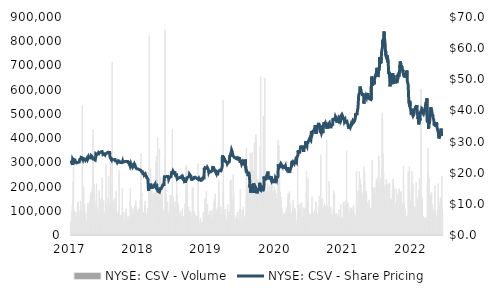
| Category | NYSE: CSV - Volume |
|---|---|
| 2017-10-13 | 52500 |
| 2017-10-16 | 56900 |
| 2017-10-17 | 97900 |
| 2017-10-18 | 36500 |
| 2017-10-19 | 77600 |
| 2017-10-20 | 123300 |
| 2017-10-23 | 126600 |
| 2017-10-24 | 219000 |
| 2017-10-25 | 149900 |
| 2017-10-26 | 285400 |
| 2017-10-27 | 97000 |
| 2017-10-30 | 99300 |
| 2017-10-31 | 71600 |
| 2017-11-01 | 91600 |
| 2017-11-02 | 77100 |
| 2017-11-03 | 48700 |
| 2017-11-06 | 57600 |
| 2017-11-07 | 92800 |
| 2017-11-08 | 62000 |
| 2017-11-09 | 71000 |
| 2017-11-10 | 55100 |
| 2017-11-13 | 69200 |
| 2017-11-14 | 52200 |
| 2017-11-15 | 120900 |
| 2017-11-16 | 133900 |
| 2017-11-17 | 137100 |
| 2017-11-20 | 61500 |
| 2017-11-21 | 95400 |
| 2017-11-22 | 38800 |
| 2017-11-24 | 35700 |
| 2017-11-27 | 68900 |
| 2017-11-28 | 79100 |
| 2017-11-29 | 139900 |
| 2017-11-30 | 105800 |
| 2017-12-01 | 87800 |
| 2017-12-04 | 66400 |
| 2017-12-05 | 78700 |
| 2017-12-06 | 100400 |
| 2017-12-07 | 82900 |
| 2017-12-08 | 535800 |
| 2017-12-11 | 80200 |
| 2017-12-12 | 78500 |
| 2017-12-13 | 70700 |
| 2017-12-14 | 58300 |
| 2017-12-15 | 199800 |
| 2017-12-18 | 107200 |
| 2017-12-19 | 125400 |
| 2017-12-20 | 75200 |
| 2017-12-21 | 91300 |
| 2017-12-22 | 81200 |
| 2017-12-26 | 39900 |
| 2017-12-27 | 44900 |
| 2017-12-28 | 61300 |
| 2017-12-29 | 56900 |
| 2018-01-02 | 105300 |
| 2018-01-03 | 119400 |
| 2018-01-04 | 130600 |
| 2018-01-05 | 69900 |
| 2018-01-08 | 110500 |
| 2018-01-09 | 76400 |
| 2018-01-10 | 97900 |
| 2018-01-11 | 82900 |
| 2018-01-12 | 135000 |
| 2018-01-16 | 88900 |
| 2018-01-17 | 162300 |
| 2018-01-18 | 159300 |
| 2018-01-19 | 175900 |
| 2018-01-22 | 86800 |
| 2018-01-23 | 53700 |
| 2018-01-24 | 167500 |
| 2018-01-25 | 190800 |
| 2018-01-26 | 73400 |
| 2018-01-29 | 435000 |
| 2018-01-30 | 125100 |
| 2018-01-31 | 316600 |
| 2018-02-01 | 112600 |
| 2018-02-02 | 81700 |
| 2018-02-05 | 207800 |
| 2018-02-06 | 169000 |
| 2018-02-07 | 125300 |
| 2018-02-08 | 84200 |
| 2018-02-09 | 107400 |
| 2018-02-12 | 75400 |
| 2018-02-13 | 70900 |
| 2018-02-14 | 80800 |
| 2018-02-15 | 144400 |
| 2018-02-16 | 211200 |
| 2018-02-20 | 113400 |
| 2018-02-21 | 51300 |
| 2018-02-22 | 69300 |
| 2018-02-23 | 47300 |
| 2018-02-26 | 96300 |
| 2018-02-27 | 70300 |
| 2018-02-28 | 61700 |
| 2018-03-01 | 184300 |
| 2018-03-02 | 149200 |
| 2018-03-05 | 90400 |
| 2018-03-06 | 88700 |
| 2018-03-07 | 57100 |
| 2018-03-08 | 61800 |
| 2018-03-09 | 149400 |
| 2018-03-12 | 99600 |
| 2018-03-13 | 110100 |
| 2018-03-14 | 108300 |
| 2018-03-15 | 237700 |
| 2018-03-16 | 125100 |
| 2018-03-19 | 65000 |
| 2018-03-20 | 47200 |
| 2018-03-21 | 61500 |
| 2018-03-22 | 69600 |
| 2018-03-23 | 144000 |
| 2018-03-26 | 72800 |
| 2018-03-27 | 64900 |
| 2018-03-28 | 86300 |
| 2018-03-29 | 91100 |
| 2018-04-02 | 78300 |
| 2018-04-03 | 291900 |
| 2018-04-04 | 121600 |
| 2018-04-05 | 92400 |
| 2018-04-06 | 115100 |
| 2018-04-09 | 60800 |
| 2018-04-10 | 95300 |
| 2018-04-11 | 67500 |
| 2018-04-12 | 69100 |
| 2018-04-13 | 153000 |
| 2018-04-16 | 242700 |
| 2018-04-17 | 125500 |
| 2018-04-18 | 57500 |
| 2018-04-19 | 35000 |
| 2018-04-20 | 97300 |
| 2018-04-23 | 77000 |
| 2018-04-24 | 123200 |
| 2018-04-25 | 308200 |
| 2018-04-26 | 277500 |
| 2018-04-27 | 173600 |
| 2018-04-30 | 151500 |
| 2018-05-01 | 164900 |
| 2018-05-02 | 118200 |
| 2018-05-03 | 712600 |
| 2018-05-04 | 199000 |
| 2018-05-07 | 58800 |
| 2018-05-08 | 64000 |
| 2018-05-09 | 93100 |
| 2018-05-10 | 140900 |
| 2018-05-11 | 90800 |
| 2018-05-14 | 106100 |
| 2018-05-15 | 96700 |
| 2018-05-16 | 149600 |
| 2018-05-17 | 79800 |
| 2018-05-18 | 124300 |
| 2018-05-21 | 108100 |
| 2018-05-22 | 179200 |
| 2018-05-23 | 76600 |
| 2018-05-24 | 121800 |
| 2018-05-25 | 83600 |
| 2018-05-29 | 80900 |
| 2018-05-30 | 94300 |
| 2018-05-31 | 82400 |
| 2018-06-01 | 89300 |
| 2018-06-04 | 101200 |
| 2018-06-05 | 97300 |
| 2018-06-06 | 267600 |
| 2018-06-07 | 81700 |
| 2018-06-08 | 64700 |
| 2018-06-11 | 59600 |
| 2018-06-12 | 78300 |
| 2018-06-13 | 67000 |
| 2018-06-14 | 66200 |
| 2018-06-15 | 81800 |
| 2018-06-18 | 39200 |
| 2018-06-19 | 48900 |
| 2018-06-20 | 72900 |
| 2018-06-21 | 85400 |
| 2018-06-22 | 191100 |
| 2018-06-25 | 76500 |
| 2018-06-26 | 55400 |
| 2018-06-27 | 71400 |
| 2018-06-28 | 84900 |
| 2018-06-29 | 95300 |
| 2018-07-02 | 61000 |
| 2018-07-03 | 50900 |
| 2018-07-05 | 59000 |
| 2018-07-06 | 51400 |
| 2018-07-09 | 92000 |
| 2018-07-10 | 107200 |
| 2018-07-11 | 81900 |
| 2018-07-12 | 35000 |
| 2018-07-13 | 55700 |
| 2018-07-16 | 49000 |
| 2018-07-17 | 58300 |
| 2018-07-18 | 48800 |
| 2018-07-19 | 49400 |
| 2018-07-20 | 78100 |
| 2018-07-23 | 49100 |
| 2018-07-24 | 43200 |
| 2018-07-25 | 44900 |
| 2018-07-26 | 65700 |
| 2018-07-27 | 50300 |
| 2018-07-30 | 72900 |
| 2018-07-31 | 143700 |
| 2018-08-01 | 191900 |
| 2018-08-02 | 123900 |
| 2018-08-03 | 116000 |
| 2018-08-06 | 86600 |
| 2018-08-07 | 73400 |
| 2018-08-08 | 89700 |
| 2018-08-09 | 65500 |
| 2018-08-10 | 28200 |
| 2018-08-13 | 108200 |
| 2018-08-14 | 72200 |
| 2018-08-15 | 77100 |
| 2018-08-16 | 84300 |
| 2018-08-17 | 58900 |
| 2018-08-20 | 79600 |
| 2018-08-21 | 77700 |
| 2018-08-22 | 120100 |
| 2018-08-23 | 97800 |
| 2018-08-24 | 83900 |
| 2018-08-27 | 141200 |
| 2018-08-28 | 50000 |
| 2018-08-29 | 42000 |
| 2018-08-30 | 113500 |
| 2018-08-31 | 77600 |
| 2018-09-04 | 61600 |
| 2018-09-05 | 95500 |
| 2018-09-06 | 87100 |
| 2018-09-07 | 103700 |
| 2018-09-10 | 89800 |
| 2018-09-11 | 108000 |
| 2018-09-12 | 102100 |
| 2018-09-13 | 63200 |
| 2018-09-14 | 59600 |
| 2018-09-17 | 54500 |
| 2018-09-18 | 142500 |
| 2018-09-19 | 147600 |
| 2018-09-20 | 70800 |
| 2018-09-21 | 335600 |
| 2018-09-24 | 104900 |
| 2018-09-25 | 107200 |
| 2018-09-26 | 170700 |
| 2018-09-27 | 82200 |
| 2018-09-28 | 98900 |
| 2018-10-01 | 91200 |
| 2018-10-02 | 92200 |
| 2018-10-03 | 75000 |
| 2018-10-04 | 85200 |
| 2018-10-05 | 75600 |
| 2018-10-08 | 57100 |
| 2018-10-09 | 45900 |
| 2018-10-10 | 97200 |
| 2018-10-11 | 124300 |
| 2018-10-12 | 140800 |
| 2018-10-15 | 84800 |
| 2018-10-16 | 69400 |
| 2018-10-17 | 85700 |
| 2018-10-18 | 81100 |
| 2018-10-19 | 53400 |
| 2018-10-22 | 65600 |
| 2018-10-23 | 110100 |
| 2018-10-24 | 74800 |
| 2018-10-25 | 90300 |
| 2018-10-26 | 101300 |
| 2018-10-29 | 68200 |
| 2018-10-30 | 254400 |
| 2018-10-31 | 175300 |
| 2018-11-01 | 822500 |
| 2018-11-02 | 305000 |
| 2018-11-05 | 263000 |
| 2018-11-06 | 133600 |
| 2018-11-07 | 205300 |
| 2018-11-08 | 271700 |
| 2018-11-09 | 229800 |
| 2018-11-12 | 146300 |
| 2018-11-13 | 139700 |
| 2018-11-14 | 216600 |
| 2018-11-15 | 115700 |
| 2018-11-16 | 93000 |
| 2018-11-19 | 128600 |
| 2018-11-20 | 171100 |
| 2018-11-21 | 121700 |
| 2018-11-23 | 32300 |
| 2018-11-26 | 143000 |
| 2018-11-27 | 83900 |
| 2018-11-28 | 147700 |
| 2018-11-29 | 174100 |
| 2018-11-30 | 177100 |
| 2018-12-03 | 236800 |
| 2018-12-04 | 300000 |
| 2018-12-06 | 324900 |
| 2018-12-07 | 147200 |
| 2018-12-10 | 152200 |
| 2018-12-11 | 75500 |
| 2018-12-12 | 403600 |
| 2018-12-13 | 102200 |
| 2018-12-14 | 147300 |
| 2018-12-17 | 181400 |
| 2018-12-18 | 169600 |
| 2018-12-19 | 121000 |
| 2018-12-20 | 140800 |
| 2018-12-21 | 355100 |
| 2018-12-24 | 135500 |
| 2018-12-26 | 237300 |
| 2018-12-27 | 200700 |
| 2018-12-28 | 158700 |
| 2018-12-31 | 150100 |
| 2019-01-02 | 129600 |
| 2019-01-03 | 136500 |
| 2019-01-04 | 182700 |
| 2019-01-07 | 79600 |
| 2019-01-08 | 101500 |
| 2019-01-09 | 61700 |
| 2019-01-10 | 80500 |
| 2019-01-11 | 91600 |
| 2019-01-14 | 97800 |
| 2019-01-15 | 107800 |
| 2019-01-16 | 133500 |
| 2019-01-17 | 846900 |
| 2019-01-18 | 321400 |
| 2019-01-22 | 171900 |
| 2019-01-23 | 126400 |
| 2019-01-24 | 69400 |
| 2019-01-25 | 70500 |
| 2019-01-28 | 83100 |
| 2019-01-29 | 82800 |
| 2019-01-30 | 137800 |
| 2019-01-31 | 95000 |
| 2019-02-01 | 74800 |
| 2019-02-04 | 83800 |
| 2019-02-05 | 55600 |
| 2019-02-06 | 76400 |
| 2019-02-07 | 94500 |
| 2019-02-08 | 79400 |
| 2019-02-11 | 164600 |
| 2019-02-12 | 126800 |
| 2019-02-13 | 45800 |
| 2019-02-14 | 89700 |
| 2019-02-15 | 146000 |
| 2019-02-19 | 138100 |
| 2019-02-20 | 133400 |
| 2019-02-21 | 167000 |
| 2019-02-22 | 434100 |
| 2019-02-25 | 145900 |
| 2019-02-26 | 158600 |
| 2019-02-27 | 77400 |
| 2019-02-28 | 124400 |
| 2019-03-01 | 95300 |
| 2019-03-04 | 103900 |
| 2019-03-05 | 110900 |
| 2019-03-06 | 94700 |
| 2019-03-07 | 95800 |
| 2019-03-08 | 138000 |
| 2019-03-11 | 74500 |
| 2019-03-12 | 101800 |
| 2019-03-13 | 103600 |
| 2019-03-14 | 73600 |
| 2019-03-15 | 252800 |
| 2019-03-18 | 165900 |
| 2019-03-19 | 79500 |
| 2019-03-20 | 127900 |
| 2019-03-21 | 98000 |
| 2019-03-22 | 131600 |
| 2019-03-25 | 117000 |
| 2019-03-26 | 39700 |
| 2019-03-27 | 74900 |
| 2019-03-28 | 57100 |
| 2019-03-29 | 86700 |
| 2019-04-01 | 48600 |
| 2019-04-02 | 79400 |
| 2019-04-03 | 98900 |
| 2019-04-04 | 73900 |
| 2019-04-05 | 40400 |
| 2019-04-08 | 78300 |
| 2019-04-09 | 53800 |
| 2019-04-10 | 51200 |
| 2019-04-11 | 31700 |
| 2019-04-12 | 110000 |
| 2019-04-15 | 45900 |
| 2019-04-16 | 63100 |
| 2019-04-17 | 76300 |
| 2019-04-18 | 57900 |
| 2019-04-22 | 59700 |
| 2019-04-23 | 75100 |
| 2019-04-24 | 102200 |
| 2019-04-25 | 129700 |
| 2019-04-26 | 63800 |
| 2019-04-29 | 132400 |
| 2019-04-30 | 286700 |
| 2019-05-01 | 198600 |
| 2019-05-02 | 280100 |
| 2019-05-03 | 178500 |
| 2019-05-06 | 263100 |
| 2019-05-07 | 179400 |
| 2019-05-08 | 82700 |
| 2019-05-09 | 89700 |
| 2019-05-10 | 72800 |
| 2019-05-13 | 115600 |
| 2019-05-14 | 102700 |
| 2019-05-15 | 81500 |
| 2019-05-16 | 78900 |
| 2019-05-17 | 91600 |
| 2019-05-20 | 92100 |
| 2019-05-21 | 96500 |
| 2019-05-22 | 73200 |
| 2019-05-23 | 71500 |
| 2019-05-24 | 68500 |
| 2019-05-28 | 77500 |
| 2019-05-29 | 83000 |
| 2019-05-30 | 92700 |
| 2019-05-31 | 197000 |
| 2019-06-03 | 193600 |
| 2019-06-04 | 69100 |
| 2019-06-05 | 78700 |
| 2019-06-06 | 86800 |
| 2019-06-07 | 99000 |
| 2019-06-10 | 96000 |
| 2019-06-11 | 84200 |
| 2019-06-12 | 62300 |
| 2019-06-13 | 80700 |
| 2019-06-14 | 46000 |
| 2019-06-17 | 39100 |
| 2019-06-18 | 49000 |
| 2019-06-19 | 65900 |
| 2019-06-20 | 72700 |
| 2019-06-21 | 77600 |
| 2019-06-24 | 72400 |
| 2019-06-25 | 65900 |
| 2019-06-26 | 48700 |
| 2019-06-27 | 60600 |
| 2019-06-28 | 295200 |
| 2019-07-01 | 97400 |
| 2019-07-02 | 42800 |
| 2019-07-03 | 11700 |
| 2019-07-05 | 49700 |
| 2019-07-08 | 39700 |
| 2019-07-09 | 47000 |
| 2019-07-10 | 67700 |
| 2019-07-11 | 40300 |
| 2019-07-12 | 43700 |
| 2019-07-15 | 47300 |
| 2019-07-16 | 46000 |
| 2019-07-17 | 52700 |
| 2019-07-18 | 42900 |
| 2019-07-19 | 50000 |
| 2019-07-22 | 47500 |
| 2019-07-23 | 92700 |
| 2019-07-24 | 45700 |
| 2019-07-25 | 60600 |
| 2019-07-26 | 32700 |
| 2019-07-29 | 49800 |
| 2019-07-30 | 61500 |
| 2019-07-31 | 118000 |
| 2019-08-01 | 151400 |
| 2019-08-02 | 78800 |
| 2019-08-05 | 118500 |
| 2019-08-06 | 124700 |
| 2019-08-07 | 86800 |
| 2019-08-08 | 180800 |
| 2019-08-09 | 84800 |
| 2019-08-12 | 66100 |
| 2019-08-13 | 77000 |
| 2019-08-14 | 127500 |
| 2019-08-15 | 83900 |
| 2019-08-16 | 81800 |
| 2019-08-19 | 44200 |
| 2019-08-20 | 42200 |
| 2019-08-21 | 43000 |
| 2019-08-22 | 58300 |
| 2019-08-23 | 98200 |
| 2019-08-26 | 73200 |
| 2019-08-27 | 55200 |
| 2019-08-28 | 64500 |
| 2019-08-29 | 36300 |
| 2019-08-30 | 101600 |
| 2019-09-03 | 55300 |
| 2019-09-04 | 34900 |
| 2019-09-05 | 57500 |
| 2019-09-06 | 70000 |
| 2019-09-09 | 50200 |
| 2019-09-10 | 102200 |
| 2019-09-11 | 93000 |
| 2019-09-12 | 131600 |
| 2019-09-13 | 81000 |
| 2019-09-16 | 144800 |
| 2019-09-17 | 72200 |
| 2019-09-18 | 147500 |
| 2019-09-19 | 67700 |
| 2019-09-20 | 170200 |
| 2019-09-23 | 88500 |
| 2019-09-24 | 103300 |
| 2019-09-25 | 85900 |
| 2019-09-26 | 56800 |
| 2019-09-27 | 48500 |
| 2019-09-30 | 70400 |
| 2019-10-01 | 112900 |
| 2019-10-02 | 96700 |
| 2019-10-03 | 112300 |
| 2019-10-04 | 94800 |
| 2019-10-07 | 165700 |
| 2019-10-08 | 226200 |
| 2019-10-09 | 64200 |
| 2019-10-10 | 109700 |
| 2019-10-11 | 82600 |
| 2019-10-14 | 66000 |
| 2019-10-15 | 116300 |
| 2019-10-16 | 74400 |
| 2019-10-17 | 115200 |
| 2019-10-18 | 85700 |
| 2019-10-21 | 79900 |
| 2019-10-22 | 39100 |
| 2019-10-23 | 67100 |
| 2019-10-24 | 74300 |
| 2019-10-25 | 114900 |
| 2019-10-28 | 173400 |
| 2019-10-29 | 555000 |
| 2019-10-30 | 181000 |
| 2019-10-31 | 122700 |
| 2019-11-01 | 86900 |
| 2019-11-04 | 60100 |
| 2019-11-05 | 65300 |
| 2019-11-06 | 80300 |
| 2019-11-07 | 105800 |
| 2019-11-08 | 44600 |
| 2019-11-11 | 62200 |
| 2019-11-12 | 59400 |
| 2019-11-13 | 35400 |
| 2019-11-14 | 63000 |
| 2019-11-15 | 46900 |
| 2019-11-18 | 48900 |
| 2019-11-19 | 107100 |
| 2019-11-20 | 125200 |
| 2019-11-21 | 36000 |
| 2019-11-22 | 46800 |
| 2019-11-25 | 57100 |
| 2019-11-26 | 81700 |
| 2019-11-27 | 94700 |
| 2019-11-29 | 51700 |
| 2019-12-02 | 78600 |
| 2019-12-03 | 218900 |
| 2019-12-04 | 220600 |
| 2019-12-05 | 135400 |
| 2019-12-06 | 227900 |
| 2019-12-09 | 152800 |
| 2019-12-10 | 117000 |
| 2019-12-11 | 96200 |
| 2019-12-12 | 81600 |
| 2019-12-13 | 99400 |
| 2019-12-16 | 139700 |
| 2019-12-17 | 251300 |
| 2019-12-18 | 84500 |
| 2019-12-19 | 82600 |
| 2019-12-20 | 172600 |
| 2019-12-23 | 78200 |
| 2019-12-24 | 34800 |
| 2019-12-26 | 44100 |
| 2019-12-27 | 62500 |
| 2019-12-30 | 68300 |
| 2019-12-31 | 59700 |
| 2020-01-02 | 74300 |
| 2020-01-03 | 81800 |
| 2020-01-06 | 77600 |
| 2020-01-07 | 94400 |
| 2020-01-08 | 66000 |
| 2020-01-09 | 54700 |
| 2020-01-10 | 60800 |
| 2020-01-13 | 39100 |
| 2020-01-14 | 47300 |
| 2020-01-15 | 38500 |
| 2020-01-16 | 105900 |
| 2020-01-17 | 84000 |
| 2020-01-21 | 187300 |
| 2020-01-22 | 49300 |
| 2020-01-23 | 69400 |
| 2020-01-24 | 62700 |
| 2020-01-27 | 40900 |
| 2020-01-28 | 35200 |
| 2020-01-29 | 39000 |
| 2020-01-30 | 103200 |
| 2020-01-31 | 86400 |
| 2020-02-03 | 59000 |
| 2020-02-04 | 89500 |
| 2020-02-05 | 115700 |
| 2020-02-06 | 51500 |
| 2020-02-07 | 45500 |
| 2020-02-10 | 58800 |
| 2020-02-11 | 77800 |
| 2020-02-12 | 52000 |
| 2020-02-13 | 38500 |
| 2020-02-14 | 63700 |
| 2020-02-18 | 44300 |
| 2020-02-19 | 153300 |
| 2020-02-20 | 359700 |
| 2020-02-21 | 182700 |
| 2020-02-24 | 137500 |
| 2020-02-25 | 204500 |
| 2020-02-26 | 186800 |
| 2020-02-27 | 202700 |
| 2020-02-28 | 192700 |
| 2020-03-02 | 167300 |
| 2020-03-03 | 200300 |
| 2020-03-04 | 182300 |
| 2020-03-05 | 161200 |
| 2020-03-06 | 153900 |
| 2020-03-09 | 176200 |
| 2020-03-10 | 337100 |
| 2020-03-11 | 143100 |
| 2020-03-12 | 200300 |
| 2020-03-13 | 278300 |
| 2020-03-16 | 195700 |
| 2020-03-17 | 189000 |
| 2020-03-18 | 340300 |
| 2020-03-19 | 247400 |
| 2020-03-20 | 272800 |
| 2020-03-23 | 269200 |
| 2020-03-24 | 150100 |
| 2020-03-25 | 181300 |
| 2020-03-26 | 247400 |
| 2020-03-27 | 260400 |
| 2020-03-30 | 380200 |
| 2020-03-31 | 237000 |
| 2020-04-01 | 189400 |
| 2020-04-02 | 170800 |
| 2020-04-03 | 146600 |
| 2020-04-06 | 413100 |
| 2020-04-07 | 383400 |
| 2020-04-08 | 225000 |
| 2020-04-09 | 164900 |
| 2020-04-13 | 135400 |
| 2020-04-14 | 231100 |
| 2020-04-15 | 188300 |
| 2020-04-16 | 203200 |
| 2020-04-17 | 227200 |
| 2020-04-20 | 160800 |
| 2020-04-21 | 188400 |
| 2020-04-22 | 113600 |
| 2020-04-23 | 93700 |
| 2020-04-24 | 87400 |
| 2020-04-27 | 364800 |
| 2020-04-28 | 145300 |
| 2020-04-29 | 279600 |
| 2020-04-30 | 653000 |
| 2020-05-01 | 153600 |
| 2020-05-04 | 187000 |
| 2020-05-05 | 190800 |
| 2020-05-06 | 201600 |
| 2020-05-07 | 179100 |
| 2020-05-08 | 128000 |
| 2020-05-11 | 170900 |
| 2020-05-12 | 165900 |
| 2020-05-13 | 491200 |
| 2020-05-14 | 194100 |
| 2020-05-15 | 107100 |
| 2020-05-18 | 138400 |
| 2020-05-19 | 286800 |
| 2020-05-20 | 646800 |
| 2020-05-21 | 267000 |
| 2020-05-22 | 155600 |
| 2020-05-26 | 148500 |
| 2020-05-27 | 121100 |
| 2020-05-28 | 119400 |
| 2020-05-29 | 178500 |
| 2020-06-01 | 178300 |
| 2020-06-02 | 199600 |
| 2020-06-03 | 213900 |
| 2020-06-04 | 140100 |
| 2020-06-05 | 156500 |
| 2020-06-08 | 146700 |
| 2020-06-09 | 178100 |
| 2020-06-10 | 119100 |
| 2020-06-11 | 202800 |
| 2020-06-12 | 163300 |
| 2020-06-15 | 141200 |
| 2020-06-16 | 167000 |
| 2020-06-17 | 99000 |
| 2020-06-18 | 156000 |
| 2020-06-19 | 213100 |
| 2020-06-22 | 203100 |
| 2020-06-23 | 91900 |
| 2020-06-24 | 160700 |
| 2020-06-25 | 127300 |
| 2020-06-26 | 229100 |
| 2020-06-29 | 140300 |
| 2020-06-30 | 181500 |
| 2020-07-01 | 133300 |
| 2020-07-02 | 91400 |
| 2020-07-06 | 126800 |
| 2020-07-07 | 198400 |
| 2020-07-08 | 186400 |
| 2020-07-09 | 175700 |
| 2020-07-10 | 83000 |
| 2020-07-13 | 172900 |
| 2020-07-14 | 97000 |
| 2020-07-15 | 151700 |
| 2020-07-16 | 124100 |
| 2020-07-17 | 90400 |
| 2020-07-20 | 130500 |
| 2020-07-21 | 113300 |
| 2020-07-22 | 99900 |
| 2020-07-23 | 390800 |
| 2020-07-24 | 67000 |
| 2020-07-27 | 100600 |
| 2020-07-28 | 144500 |
| 2020-07-29 | 369500 |
| 2020-07-30 | 216100 |
| 2020-07-31 | 235800 |
| 2020-08-03 | 176200 |
| 2020-08-04 | 101600 |
| 2020-08-05 | 135500 |
| 2020-08-06 | 119500 |
| 2020-08-07 | 156600 |
| 2020-08-10 | 108400 |
| 2020-08-11 | 107900 |
| 2020-08-12 | 70400 |
| 2020-08-13 | 66500 |
| 2020-08-14 | 49500 |
| 2020-08-17 | 57500 |
| 2020-08-18 | 76400 |
| 2020-08-19 | 91000 |
| 2020-08-20 | 52800 |
| 2020-08-21 | 86500 |
| 2020-08-24 | 71600 |
| 2020-08-25 | 83000 |
| 2020-08-26 | 55500 |
| 2020-08-27 | 61300 |
| 2020-08-28 | 31500 |
| 2020-08-31 | 94200 |
| 2020-09-01 | 68800 |
| 2020-09-02 | 74100 |
| 2020-09-03 | 112800 |
| 2020-09-04 | 66100 |
| 2020-09-08 | 72200 |
| 2020-09-09 | 125900 |
| 2020-09-10 | 157100 |
| 2020-09-11 | 170800 |
| 2020-09-14 | 165600 |
| 2020-09-15 | 79400 |
| 2020-09-16 | 92300 |
| 2020-09-17 | 67200 |
| 2020-09-18 | 179000 |
| 2020-09-21 | 130500 |
| 2020-09-22 | 53400 |
| 2020-09-23 | 92200 |
| 2020-09-24 | 73700 |
| 2020-09-25 | 81800 |
| 2020-09-28 | 87000 |
| 2020-09-29 | 57900 |
| 2020-09-30 | 69700 |
| 2020-10-01 | 73400 |
| 2020-10-02 | 102500 |
| 2020-10-05 | 142500 |
| 2020-10-06 | 116800 |
| 2020-10-07 | 92200 |
| 2020-10-08 | 84900 |
| 2020-10-09 | 67100 |
| 2020-10-12 | 49000 |
| 2020-10-13 | 66800 |
| 2020-10-14 | 103500 |
| 2020-10-15 | 110900 |
| 2020-10-16 | 77600 |
| 2020-10-19 | 62400 |
| 2020-10-20 | 58300 |
| 2020-10-21 | 34500 |
| 2020-10-22 | 46500 |
| 2020-10-23 | 59500 |
| 2020-10-26 | 48400 |
| 2020-10-27 | 88800 |
| 2020-10-28 | 304500 |
| 2020-10-29 | 123000 |
| 2020-10-30 | 121300 |
| 2020-11-02 | 87600 |
| 2020-11-03 | 108900 |
| 2020-11-04 | 69400 |
| 2020-11-05 | 47100 |
| 2020-11-06 | 60400 |
| 2020-11-09 | 128800 |
| 2020-11-10 | 60300 |
| 2020-11-11 | 49200 |
| 2020-11-12 | 68800 |
| 2020-11-13 | 60800 |
| 2020-11-16 | 134300 |
| 2020-11-17 | 57200 |
| 2020-11-18 | 52200 |
| 2020-11-19 | 46300 |
| 2020-11-20 | 63000 |
| 2020-11-23 | 58500 |
| 2020-11-24 | 112600 |
| 2020-11-25 | 70000 |
| 2020-11-27 | 28800 |
| 2020-11-30 | 108500 |
| 2020-12-01 | 96000 |
| 2020-12-02 | 55600 |
| 2020-12-03 | 42700 |
| 2020-12-04 | 43900 |
| 2020-12-07 | 58300 |
| 2020-12-08 | 114400 |
| 2020-12-09 | 177100 |
| 2020-12-10 | 262000 |
| 2020-12-11 | 107400 |
| 2020-12-14 | 100400 |
| 2020-12-15 | 83000 |
| 2020-12-16 | 91200 |
| 2020-12-17 | 135100 |
| 2020-12-18 | 232800 |
| 2020-12-21 | 92500 |
| 2020-12-22 | 71200 |
| 2020-12-23 | 81300 |
| 2020-12-24 | 29900 |
| 2020-12-28 | 86500 |
| 2020-12-29 | 80400 |
| 2020-12-30 | 46500 |
| 2020-12-31 | 53200 |
| 2021-01-04 | 77900 |
| 2021-01-05 | 94900 |
| 2021-01-06 | 157100 |
| 2021-01-07 | 117700 |
| 2021-01-08 | 92400 |
| 2021-01-11 | 78600 |
| 2021-01-12 | 82100 |
| 2021-01-13 | 76100 |
| 2021-01-14 | 90700 |
| 2021-01-15 | 60100 |
| 2021-01-19 | 76900 |
| 2021-01-20 | 101600 |
| 2021-01-21 | 95100 |
| 2021-01-22 | 80700 |
| 2021-01-25 | 136800 |
| 2021-01-26 | 100900 |
| 2021-01-27 | 124600 |
| 2021-01-28 | 118600 |
| 2021-01-29 | 94000 |
| 2021-02-01 | 56100 |
| 2021-02-02 | 54700 |
| 2021-02-03 | 85300 |
| 2021-02-04 | 59400 |
| 2021-02-05 | 49400 |
| 2021-02-08 | 57100 |
| 2021-02-09 | 74500 |
| 2021-02-10 | 117500 |
| 2021-02-11 | 160300 |
| 2021-02-12 | 115100 |
| 2021-02-16 | 106200 |
| 2021-02-17 | 90100 |
| 2021-02-18 | 331300 |
| 2021-02-19 | 96100 |
| 2021-02-22 | 120400 |
| 2021-02-23 | 147800 |
| 2021-02-24 | 104600 |
| 2021-02-25 | 80200 |
| 2021-02-26 | 151300 |
| 2021-03-01 | 77800 |
| 2021-03-02 | 80300 |
| 2021-03-03 | 71700 |
| 2021-03-04 | 107000 |
| 2021-03-05 | 114900 |
| 2021-03-08 | 129400 |
| 2021-03-09 | 114400 |
| 2021-03-10 | 102200 |
| 2021-03-11 | 120900 |
| 2021-03-12 | 117500 |
| 2021-03-15 | 114200 |
| 2021-03-16 | 72200 |
| 2021-03-17 | 66000 |
| 2021-03-18 | 91100 |
| 2021-03-19 | 391600 |
| 2021-03-22 | 113000 |
| 2021-03-23 | 111400 |
| 2021-03-24 | 119000 |
| 2021-03-25 | 75700 |
| 2021-03-26 | 54100 |
| 2021-03-29 | 83300 |
| 2021-03-30 | 87100 |
| 2021-03-31 | 221800 |
| 2021-04-01 | 111400 |
| 2021-04-05 | 114000 |
| 2021-04-06 | 66100 |
| 2021-04-07 | 83300 |
| 2021-04-08 | 116200 |
| 2021-04-09 | 52600 |
| 2021-04-12 | 43200 |
| 2021-04-13 | 53900 |
| 2021-04-14 | 84500 |
| 2021-04-15 | 33800 |
| 2021-04-16 | 52100 |
| 2021-04-19 | 75500 |
| 2021-04-20 | 104600 |
| 2021-04-21 | 55000 |
| 2021-04-22 | 184800 |
| 2021-04-23 | 107400 |
| 2021-04-26 | 172200 |
| 2021-04-27 | 85500 |
| 2021-04-28 | 63700 |
| 2021-04-29 | 53000 |
| 2021-04-30 | 76900 |
| 2021-05-03 | 51300 |
| 2021-05-04 | 87900 |
| 2021-05-05 | 86800 |
| 2021-05-06 | 56200 |
| 2021-05-07 | 41800 |
| 2021-05-10 | 74500 |
| 2021-05-11 | 65700 |
| 2021-05-12 | 58400 |
| 2021-05-13 | 31000 |
| 2021-05-14 | 85700 |
| 2021-05-17 | 48700 |
| 2021-05-18 | 104100 |
| 2021-05-19 | 69900 |
| 2021-05-20 | 62400 |
| 2021-05-21 | 55300 |
| 2021-05-24 | 56400 |
| 2021-05-25 | 68800 |
| 2021-05-26 | 60200 |
| 2021-05-27 | 125700 |
| 2021-05-28 | 44000 |
| 2021-06-01 | 65500 |
| 2021-06-02 | 47600 |
| 2021-06-03 | 69700 |
| 2021-06-04 | 71300 |
| 2021-06-07 | 52000 |
| 2021-06-08 | 58900 |
| 2021-06-09 | 134900 |
| 2021-06-10 | 84600 |
| 2021-06-11 | 117600 |
| 2021-06-14 | 65600 |
| 2021-06-15 | 61700 |
| 2021-06-16 | 90600 |
| 2021-06-17 | 68300 |
| 2021-06-18 | 139600 |
| 2021-06-21 | 77200 |
| 2021-06-22 | 110000 |
| 2021-06-23 | 129000 |
| 2021-06-24 | 57400 |
| 2021-06-25 | 345800 |
| 2021-06-28 | 114700 |
| 2021-06-29 | 96500 |
| 2021-06-30 | 79700 |
| 2021-07-01 | 133400 |
| 2021-07-02 | 65300 |
| 2021-07-06 | 53700 |
| 2021-07-07 | 85700 |
| 2021-07-08 | 76200 |
| 2021-07-09 | 43200 |
| 2021-07-12 | 114500 |
| 2021-07-13 | 48600 |
| 2021-07-14 | 104900 |
| 2021-07-15 | 82900 |
| 2021-07-16 | 41000 |
| 2021-07-19 | 109400 |
| 2021-07-20 | 78400 |
| 2021-07-21 | 87100 |
| 2021-07-22 | 29600 |
| 2021-07-23 | 36700 |
| 2021-07-26 | 102600 |
| 2021-07-27 | 46400 |
| 2021-07-28 | 121900 |
| 2021-07-29 | 116700 |
| 2021-07-30 | 87700 |
| 2021-08-02 | 63000 |
| 2021-08-03 | 88500 |
| 2021-08-04 | 64100 |
| 2021-08-05 | 55400 |
| 2021-08-06 | 69100 |
| 2021-08-09 | 54100 |
| 2021-08-10 | 76000 |
| 2021-08-11 | 66700 |
| 2021-08-12 | 262500 |
| 2021-08-13 | 108100 |
| 2021-08-16 | 106100 |
| 2021-08-17 | 118200 |
| 2021-08-18 | 125600 |
| 2021-08-19 | 102200 |
| 2021-08-20 | 181300 |
| 2021-08-23 | 115000 |
| 2021-08-24 | 152900 |
| 2021-08-25 | 167400 |
| 2021-08-26 | 261500 |
| 2021-08-27 | 208600 |
| 2021-08-30 | 230000 |
| 2021-08-31 | 179500 |
| 2021-09-01 | 211500 |
| 2021-09-02 | 206100 |
| 2021-09-03 | 139700 |
| 2021-09-07 | 136700 |
| 2021-09-08 | 126500 |
| 2021-09-09 | 174400 |
| 2021-09-10 | 109500 |
| 2021-09-13 | 148000 |
| 2021-09-14 | 164700 |
| 2021-09-15 | 136000 |
| 2021-09-16 | 171900 |
| 2021-09-17 | 281500 |
| 2021-09-20 | 216900 |
| 2021-09-21 | 256600 |
| 2021-09-22 | 180600 |
| 2021-09-23 | 168400 |
| 2021-09-24 | 144300 |
| 2021-09-27 | 151900 |
| 2021-09-28 | 128000 |
| 2021-09-29 | 179700 |
| 2021-09-30 | 168800 |
| 2021-10-01 | 84500 |
| 2021-10-04 | 75200 |
| 2021-10-05 | 131900 |
| 2021-10-06 | 69500 |
| 2021-10-07 | 46300 |
| 2021-10-08 | 32100 |
| 2021-10-11 | 32200 |
| 2021-10-12 | 143900 |
| 2021-10-13 | 27900 |
| 2021-10-14 | 81000 |
| 2021-10-15 | 110500 |
| 2021-10-18 | 111100 |
| 2021-10-19 | 43200 |
| 2021-10-20 | 39600 |
| 2021-10-21 | 91100 |
| 2021-10-22 | 110900 |
| 2021-10-25 | 105300 |
| 2021-10-26 | 79700 |
| 2021-10-27 | 93100 |
| 2021-10-28 | 309000 |
| 2021-10-29 | 198500 |
| 2021-11-01 | 177600 |
| 2021-11-02 | 152300 |
| 2021-11-03 | 83200 |
| 2021-11-04 | 71100 |
| 2021-11-05 | 192600 |
| 2021-11-08 | 175100 |
| 2021-11-09 | 197100 |
| 2021-11-10 | 134900 |
| 2021-11-11 | 89900 |
| 2021-11-12 | 86000 |
| 2021-11-15 | 168500 |
| 2021-11-16 | 115700 |
| 2021-11-17 | 228600 |
| 2021-11-18 | 127200 |
| 2021-11-19 | 206400 |
| 2021-11-22 | 210300 |
| 2021-11-23 | 237600 |
| 2021-11-24 | 175800 |
| 2021-11-26 | 106400 |
| 2021-11-29 | 160300 |
| 2021-11-30 | 325400 |
| 2021-12-01 | 200100 |
| 2021-12-02 | 168100 |
| 2021-12-03 | 179700 |
| 2021-12-06 | 159200 |
| 2021-12-07 | 186500 |
| 2021-12-08 | 233500 |
| 2021-12-09 | 215400 |
| 2021-12-10 | 152000 |
| 2021-12-13 | 202200 |
| 2021-12-14 | 268900 |
| 2021-12-15 | 276800 |
| 2021-12-16 | 503800 |
| 2021-12-17 | 483000 |
| 2021-12-20 | 336000 |
| 2021-12-21 | 190500 |
| 2021-12-22 | 201500 |
| 2021-12-23 | 255200 |
| 2021-12-27 | 189400 |
| 2021-12-28 | 142900 |
| 2021-12-29 | 134300 |
| 2021-12-30 | 129700 |
| 2021-12-31 | 204200 |
| 2022-01-03 | 180800 |
| 2022-01-04 | 146400 |
| 2022-01-05 | 230900 |
| 2022-01-06 | 115900 |
| 2022-01-07 | 108200 |
| 2022-01-10 | 122900 |
| 2022-01-11 | 117100 |
| 2022-01-12 | 210500 |
| 2022-01-13 | 81100 |
| 2022-01-14 | 139300 |
| 2022-01-18 | 122500 |
| 2022-01-19 | 204300 |
| 2022-01-20 | 214900 |
| 2022-01-21 | 210300 |
| 2022-01-24 | 138000 |
| 2022-01-25 | 125100 |
| 2022-01-26 | 141600 |
| 2022-01-27 | 144200 |
| 2022-01-28 | 149000 |
| 2022-01-31 | 134900 |
| 2022-02-01 | 92400 |
| 2022-02-02 | 122000 |
| 2022-02-03 | 82500 |
| 2022-02-04 | 188300 |
| 2022-02-07 | 230400 |
| 2022-02-08 | 173600 |
| 2022-02-09 | 221700 |
| 2022-02-10 | 189700 |
| 2022-02-11 | 93900 |
| 2022-02-14 | 193000 |
| 2022-02-15 | 113100 |
| 2022-02-16 | 104900 |
| 2022-02-17 | 110600 |
| 2022-02-18 | 130500 |
| 2022-02-22 | 107200 |
| 2022-02-23 | 125300 |
| 2022-02-24 | 189600 |
| 2022-02-25 | 136900 |
| 2022-02-28 | 122800 |
| 2022-03-01 | 166200 |
| 2022-03-02 | 117700 |
| 2022-03-03 | 89900 |
| 2022-03-04 | 117400 |
| 2022-03-07 | 141500 |
| 2022-03-08 | 154100 |
| 2022-03-09 | 191300 |
| 2022-03-10 | 107200 |
| 2022-03-11 | 104700 |
| 2022-03-14 | 175300 |
| 2022-03-15 | 137400 |
| 2022-03-16 | 123000 |
| 2022-03-17 | 100200 |
| 2022-03-18 | 179200 |
| 2022-03-21 | 97400 |
| 2022-03-22 | 74300 |
| 2022-03-23 | 128500 |
| 2022-03-24 | 82200 |
| 2022-03-25 | 83700 |
| 2022-03-28 | 74600 |
| 2022-03-29 | 123300 |
| 2022-03-30 | 283600 |
| 2022-03-31 | 209300 |
| 2022-04-01 | 134200 |
| 2022-04-04 | 108500 |
| 2022-04-05 | 111900 |
| 2022-04-06 | 103300 |
| 2022-04-07 | 68700 |
| 2022-04-08 | 92800 |
| 2022-04-11 | 49900 |
| 2022-04-12 | 61700 |
| 2022-04-13 | 76700 |
| 2022-04-14 | 74300 |
| 2022-04-18 | 53100 |
| 2022-04-19 | 68700 |
| 2022-04-20 | 82300 |
| 2022-04-21 | 57600 |
| 2022-04-22 | 262600 |
| 2022-04-25 | 120400 |
| 2022-04-26 | 80400 |
| 2022-04-27 | 114400 |
| 2022-04-28 | 283800 |
| 2022-04-29 | 193100 |
| 2022-05-02 | 140100 |
| 2022-05-03 | 139200 |
| 2022-05-04 | 139900 |
| 2022-05-05 | 85600 |
| 2022-05-06 | 112400 |
| 2022-05-09 | 171400 |
| 2022-05-10 | 263400 |
| 2022-05-11 | 212500 |
| 2022-05-12 | 124400 |
| 2022-05-13 | 74700 |
| 2022-05-16 | 207400 |
| 2022-05-17 | 93400 |
| 2022-05-18 | 91300 |
| 2022-05-19 | 117900 |
| 2022-05-20 | 97700 |
| 2022-05-23 | 103000 |
| 2022-05-24 | 89800 |
| 2022-05-25 | 114900 |
| 2022-05-26 | 75200 |
| 2022-05-27 | 93800 |
| 2022-05-31 | 216100 |
| 2022-06-01 | 84500 |
| 2022-06-02 | 76600 |
| 2022-06-03 | 71400 |
| 2022-06-06 | 88000 |
| 2022-06-07 | 70100 |
| 2022-06-08 | 90900 |
| 2022-06-09 | 139300 |
| 2022-06-10 | 155600 |
| 2022-06-13 | 180500 |
| 2022-06-14 | 123900 |
| 2022-06-15 | 186400 |
| 2022-06-16 | 133400 |
| 2022-06-17 | 233600 |
| 2022-06-21 | 120400 |
| 2022-06-22 | 163100 |
| 2022-06-23 | 136900 |
| 2022-06-24 | 602800 |
| 2022-06-27 | 127200 |
| 2022-06-28 | 146100 |
| 2022-06-29 | 117100 |
| 2022-06-30 | 155000 |
| 2022-07-01 | 72500 |
| 2022-07-05 | 76600 |
| 2022-07-06 | 72100 |
| 2022-07-07 | 56300 |
| 2022-07-08 | 50000 |
| 2022-07-11 | 47100 |
| 2022-07-12 | 66100 |
| 2022-07-13 | 70200 |
| 2022-07-14 | 60400 |
| 2022-07-15 | 65800 |
| 2022-07-18 | 47800 |
| 2022-07-19 | 73100 |
| 2022-07-20 | 64900 |
| 2022-07-21 | 60600 |
| 2022-07-22 | 50200 |
| 2022-07-25 | 205700 |
| 2022-07-26 | 94100 |
| 2022-07-27 | 112900 |
| 2022-07-28 | 358500 |
| 2022-07-29 | 250100 |
| 2022-08-01 | 224600 |
| 2022-08-02 | 233700 |
| 2022-08-03 | 189700 |
| 2022-08-04 | 143900 |
| 2022-08-05 | 184500 |
| 2022-08-08 | 164900 |
| 2022-08-09 | 72600 |
| 2022-08-10 | 108400 |
| 2022-08-11 | 85700 |
| 2022-08-12 | 87000 |
| 2022-08-15 | 175100 |
| 2022-08-16 | 124700 |
| 2022-08-17 | 127200 |
| 2022-08-18 | 69600 |
| 2022-08-19 | 118500 |
| 2022-08-22 | 105000 |
| 2022-08-23 | 71600 |
| 2022-08-24 | 70100 |
| 2022-08-25 | 47000 |
| 2022-08-26 | 87900 |
| 2022-08-29 | 64600 |
| 2022-08-30 | 113600 |
| 2022-08-31 | 204800 |
| 2022-09-01 | 92500 |
| 2022-09-02 | 70700 |
| 2022-09-06 | 74500 |
| 2022-09-07 | 63700 |
| 2022-09-08 | 63500 |
| 2022-09-09 | 54600 |
| 2022-09-12 | 103200 |
| 2022-09-13 | 80300 |
| 2022-09-14 | 98600 |
| 2022-09-15 | 81800 |
| 2022-09-16 | 211900 |
| 2022-09-19 | 65000 |
| 2022-09-20 | 116800 |
| 2022-09-21 | 93400 |
| 2022-09-22 | 118500 |
| 2022-09-23 | 112500 |
| 2022-09-26 | 133800 |
| 2022-09-27 | 154000 |
| 2022-09-28 | 122600 |
| 2022-09-29 | 89600 |
| 2022-09-30 | 124300 |
| 2022-10-03 | 107300 |
| 2022-10-04 | 242900 |
| 2022-10-05 | 104600 |
| 2022-10-06 | 92500 |
| 2022-10-07 | 95900 |
| 2022-10-10 | 63800 |
| 2022-10-11 | 100900 |
| 2022-10-12 | 113000 |
| 2022-10-13 | 157972 |